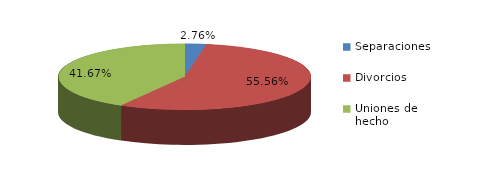
| Category | Series 0 |
|---|---|
| Separaciones | 38 |
| Divorcios | 764 |
| Uniones de hecho | 573 |